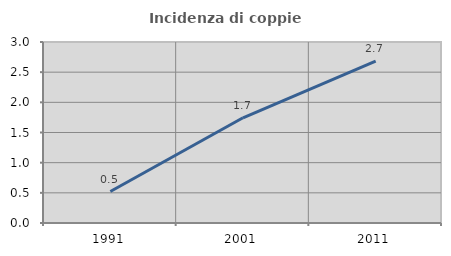
| Category | Incidenza di coppie miste |
|---|---|
| 1991.0 | 0.522 |
| 2001.0 | 1.744 |
| 2011.0 | 2.683 |